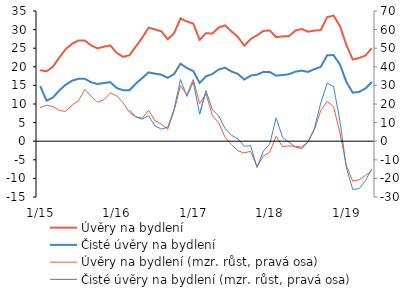
| Category | Úvěry na bydlení | Čisté úvěry na bydlení |
|---|---|---|
|  1/15 | 19.084 | 14.817 |
| 2 | 18.787 | 10.906 |
| 3 | 20.029 | 11.73 |
| 4 | 22.529 | 13.662 |
| 5 | 24.752 | 15.182 |
| 6 | 26.195 | 16.268 |
| 7 | 27.076 | 16.771 |
| 8 | 27.066 | 16.781 |
| 9 | 25.73 | 15.828 |
| 10 | 24.967 | 15.375 |
| 11 | 25.42 | 15.639 |
| 12 | 25.743 | 15.861 |
|  1/16 | 23.745 | 14.299 |
| 2 | 22.673 | 13.677 |
| 3 | 23.115 | 13.704 |
| 4 | 25.469 | 15.456 |
| 5 | 27.807 | 16.98 |
| 6 | 30.54 | 18.499 |
| 7 | 30.042 | 18.154 |
| 8 | 29.555 | 17.875 |
| 9 | 27.388 | 17.023 |
| 10 | 29.036 | 18.044 |
| 11 | 33.011 | 20.829 |
| 12 | 32.18 | 19.666 |
|  1/17 | 31.63 | 18.86 |
| 2 | 27.255 | 15.667 |
| 3 | 29.015 | 17.424 |
| 4 | 28.955 | 18.083 |
| 5 | 30.579 | 19.281 |
| 6 | 31.145 | 19.759 |
| 7 | 29.509 | 18.729 |
| 8 | 28.03 | 18.109 |
| 9 | 25.655 | 16.561 |
| 10 | 27.462 | 17.612 |
| 11 | 28.474 | 17.888 |
| 12 | 29.638 | 18.625 |
|  1/18 | 29.767 | 18.587 |
| 2 | 27.982 | 17.634 |
| 3 | 28.173 | 17.779 |
| 4 | 28.224 | 17.993 |
| 5 | 29.726 | 18.68 |
| 6 | 30.168 | 18.974 |
| 7 | 29.437 | 18.624 |
| 8 | 29.74 | 19.378 |
| 9 | 29.882 | 19.973 |
| 10 | 33.339 | 23.116 |
| 11 | 33.777 | 23.15 |
| 12 | 30.952 | 20.645 |
|  1/19 | 25.923 | 15.968 |
| 2 | 21.972 | 13.06 |
| 3 | 22.344 | 13.235 |
| 4 | 23.035 | 14.181 |
| 5 | 24.98 | 15.898 |